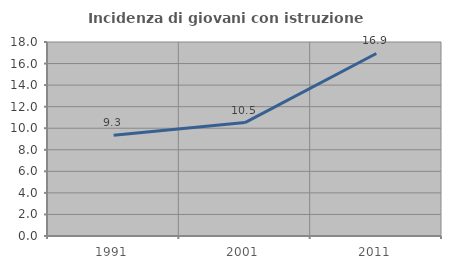
| Category | Incidenza di giovani con istruzione universitaria |
|---|---|
| 1991.0 | 9.341 |
| 2001.0 | 10.526 |
| 2011.0 | 16.935 |